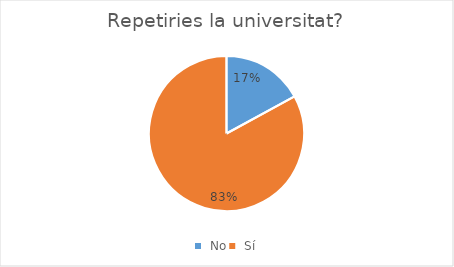
| Category | Series 0 |
|---|---|
|  No | 36 |
|  Sí | 175 |